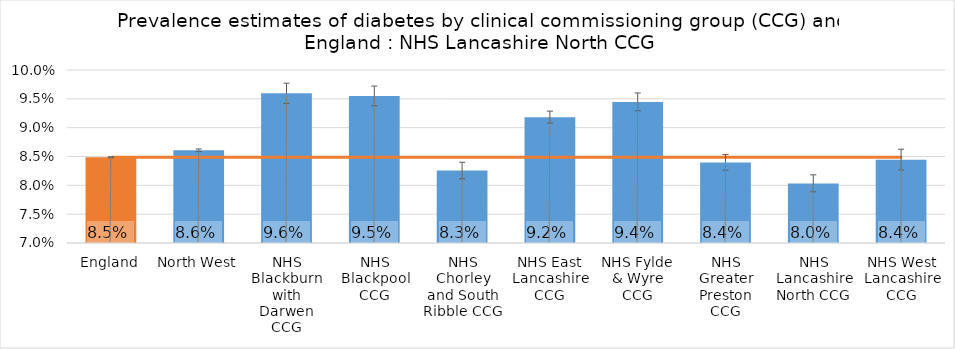
| Category | Prevalence |
|---|---|
| England | 0.085 |
| North West | 0.086 |
| NHS Blackburn with Darwen CCG | 0.096 |
| NHS Blackpool CCG | 0.095 |
| NHS Chorley and South Ribble CCG | 0.083 |
| NHS East Lancashire CCG | 0.092 |
| NHS Fylde & Wyre CCG | 0.094 |
| NHS Greater Preston CCG | 0.084 |
| NHS Lancashire North CCG | 0.08 |
| NHS West Lancashire CCG | 0.084 |